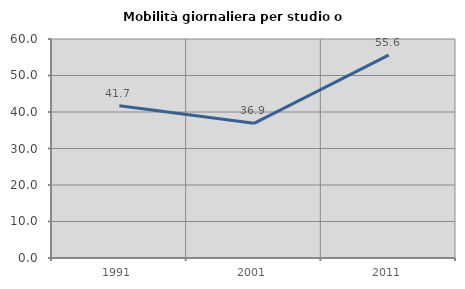
| Category | Mobilità giornaliera per studio o lavoro |
|---|---|
| 1991.0 | 41.692 |
| 2001.0 | 36.905 |
| 2011.0 | 55.572 |